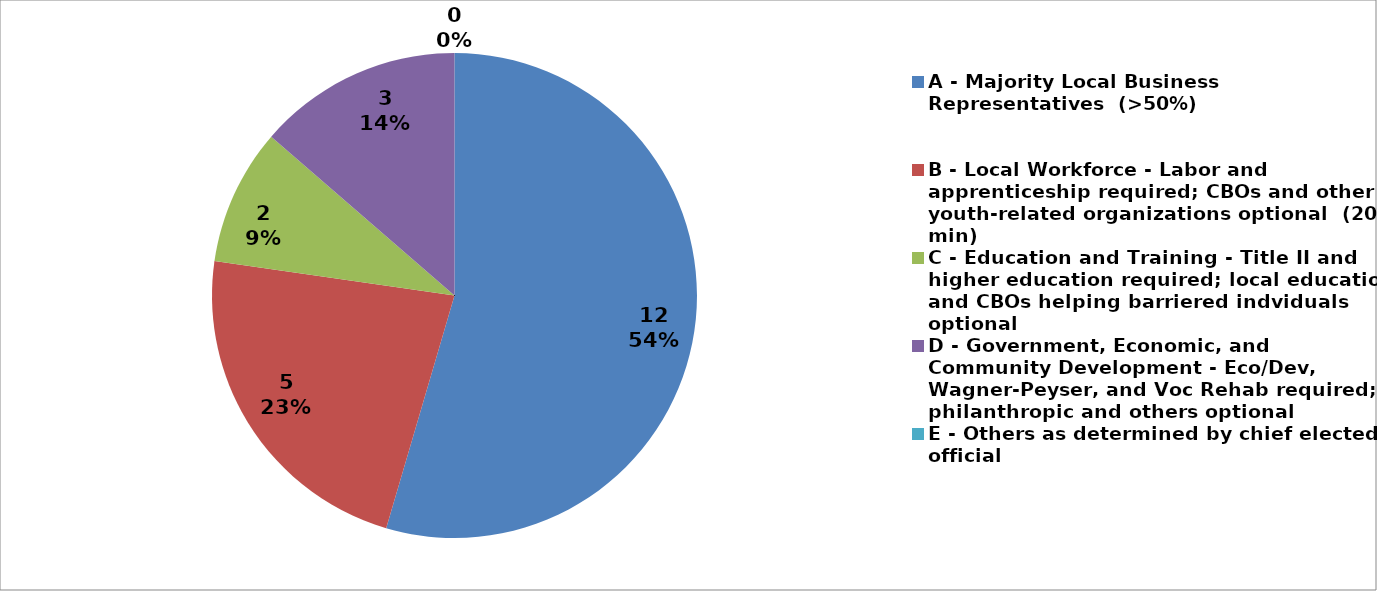
| Category | Series 0 |
|---|---|
| A - Majority Local Business Representatives  (>50%) | 12 |
| B - Local Workforce - Labor and apprenticeship required; CBOs and other youth-related organizations optional  (20% min) | 5 |
| C - Education and Training - Title II and higher education required; local education and CBOs helping barriered indviduals optional | 2 |
| D - Government, Economic, and Community Development - Eco/Dev, Wagner-Peyser, and Voc Rehab required; philanthropic and others optional | 3 |
| E - Others as determined by chief elected official | 0 |